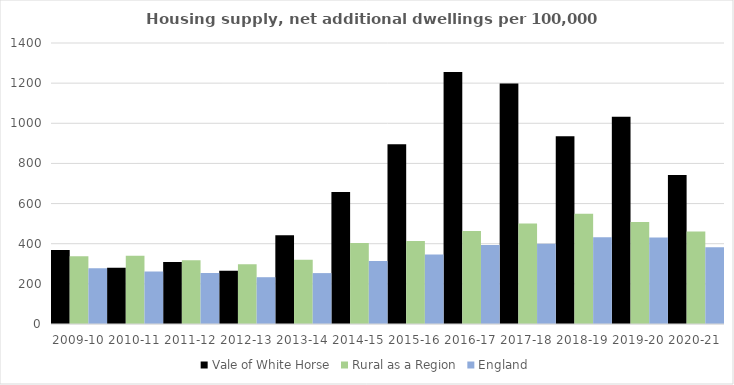
| Category | Vale of White Horse | Rural as a Region | England |
|---|---|---|---|
| 2009-10 | 368.17 | 337.852 | 277.548 |
| 2010-11 | 279.665 | 340.105 | 260.994 |
| 2011-12 | 308.472 | 317.04 | 254.007 |
| 2012-13 | 265.667 | 297.763 | 233.153 |
| 2013-14 | 442.116 | 319.835 | 253.602 |
| 2014-15 | 657.193 | 403.796 | 314.256 |
| 2015-16 | 895.412 | 414.091 | 346.154 |
| 2016-17 | 1255.315 | 463.209 | 393.256 |
| 2017-18 | 1198.686 | 500.68 | 399.646 |
| 2018-19 | 935.453 | 549.491 | 432.099 |
| 2019-20 | 1033.035 | 508.493 | 431.187 |
| 2020-21 | 742.513 | 461.114 | 382.827 |